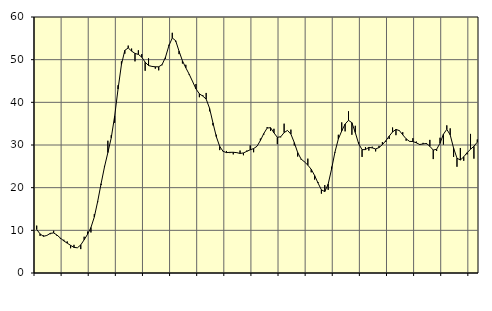
| Category | Piggar | Series 1 |
|---|---|---|
| nan | 11.1 | 10.21 |
| 87.0 | 8.7 | 9.15 |
| 87.0 | 8.8 | 8.6 |
| 87.0 | 8.8 | 8.8 |
| nan | 9.1 | 9.29 |
| 88.0 | 9.9 | 9.39 |
| 88.0 | 8.7 | 8.89 |
| 88.0 | 8 | 8.18 |
| nan | 7.8 | 7.52 |
| 89.0 | 7.4 | 7 |
| 89.0 | 5.8 | 6.48 |
| 89.0 | 6.6 | 6 |
| nan | 5.9 | 5.91 |
| 90.0 | 5.6 | 6.58 |
| 90.0 | 8.5 | 7.78 |
| 90.0 | 9.7 | 9.07 |
| nan | 9.5 | 10.66 |
| 91.0 | 13.8 | 13.12 |
| 91.0 | 16.6 | 16.79 |
| 91.0 | 20.6 | 20.93 |
| nan | 25.1 | 24.85 |
| 92.0 | 31 | 28.22 |
| 92.0 | 32.3 | 31.69 |
| 92.0 | 35.2 | 36.75 |
| nan | 44 | 43.11 |
| 93.0 | 49.6 | 48.84 |
| 93.0 | 51.4 | 52.18 |
| 93.0 | 53.3 | 52.75 |
| nan | 52.6 | 52.01 |
| 94.0 | 49.6 | 51.46 |
| 94.0 | 52.2 | 51.23 |
| 94.0 | 51.3 | 50.59 |
| nan | 47.4 | 49.42 |
| 95.0 | 50.3 | 48.62 |
| 95.0 | 48.4 | 48.42 |
| 95.0 | 47.9 | 48.33 |
| nan | 47.5 | 48.33 |
| 96.0 | 48.7 | 48.84 |
| 96.0 | 50.2 | 50.58 |
| 96.0 | 53.5 | 53.26 |
| nan | 56.3 | 55.09 |
| 97.0 | 54.2 | 54.45 |
| 97.0 | 51.3 | 52 |
| 97.0 | 49.1 | 49.74 |
| nan | 48.8 | 48.09 |
| 98.0 | 46.4 | 46.58 |
| 98.0 | 44.8 | 44.87 |
| 98.0 | 44.3 | 43.14 |
| nan | 41.2 | 41.99 |
| 99.0 | 41.7 | 41.47 |
| 99.0 | 42.2 | 40.76 |
| 99.0 | 37.9 | 38.61 |
| nan | 34.6 | 35.19 |
| 0.0 | 32.4 | 31.94 |
| 0.0 | 28.8 | 29.66 |
| 0.0 | 28.6 | 28.51 |
| nan | 28.6 | 28.22 |
| 1.0 | 28.1 | 28.28 |
| 1.0 | 27.8 | 28.29 |
| 1.0 | 28.3 | 28.21 |
| nan | 28.7 | 28.02 |
| 2.0 | 27.6 | 28.14 |
| 2.0 | 28.7 | 28.51 |
| 2.0 | 29.9 | 28.88 |
| nan | 28.3 | 29.16 |
| 3.0 | 29.7 | 29.7 |
| 3.0 | 31.5 | 31.05 |
| 3.0 | 32.4 | 32.68 |
| nan | 34.2 | 33.97 |
| 4.0 | 33.3 | 34.06 |
| 4.0 | 33.8 | 32.85 |
| 4.0 | 30.2 | 31.8 |
| nan | 31.8 | 31.93 |
| 5.0 | 35 | 32.91 |
| 5.0 | 33.4 | 33.41 |
| 5.0 | 33.6 | 32.55 |
| nan | 29.9 | 30.57 |
| 6.0 | 27.3 | 28.24 |
| 6.0 | 26.6 | 26.72 |
| 6.0 | 26.1 | 26.05 |
| nan | 26.8 | 25.29 |
| 7.0 | 23.6 | 24.3 |
| 7.0 | 21.9 | 22.85 |
| 7.0 | 21.3 | 21.09 |
| nan | 18.6 | 19.49 |
| 8.0 | 20.6 | 19.08 |
| 8.0 | 19.5 | 20.84 |
| 8.0 | 24.9 | 24.37 |
| nan | 28.2 | 28.34 |
| 9.0 | 32.4 | 31.41 |
| 9.0 | 35.3 | 33.29 |
| 9.0 | 33.2 | 34.91 |
| nan | 37.9 | 35.78 |
| 10.0 | 32.4 | 35.23 |
| 10.0 | 34.5 | 32.92 |
| 10.0 | 30.7 | 30.28 |
| nan | 27.2 | 28.91 |
| 11.0 | 29.5 | 28.92 |
| 11.0 | 28.7 | 29.45 |
| 11.0 | 29.6 | 29.32 |
| nan | 28.5 | 29.07 |
| 12.0 | 29.8 | 29.4 |
| 12.0 | 30.7 | 30.09 |
| 12.0 | 30.7 | 30.98 |
| nan | 31.4 | 32.08 |
| 13.0 | 34.1 | 33.06 |
| 13.0 | 32.3 | 33.65 |
| 13.0 | 33.3 | 33.38 |
| nan | 33 | 32.39 |
| 14.0 | 31 | 31.45 |
| 14.0 | 30.9 | 30.85 |
| 14.0 | 31.6 | 30.81 |
| nan | 30.8 | 30.51 |
| 15.0 | 30 | 30.12 |
| 15.0 | 30.5 | 30.24 |
| 15.0 | 30.2 | 30.36 |
| nan | 31.2 | 29.69 |
| 16.0 | 26.7 | 28.82 |
| 16.0 | 28.6 | 28.99 |
| 16.0 | 31.7 | 30.42 |
| nan | 30.1 | 32.52 |
| 17.0 | 34.6 | 33.67 |
| 17.0 | 33.9 | 32.37 |
| 17.0 | 27.2 | 29.27 |
| nan | 24.9 | 26.91 |
| 18.0 | 29.3 | 26.48 |
| 18.0 | 26.3 | 27.23 |
| 18.0 | 27.8 | 28.21 |
| nan | 32.6 | 29 |
| 19.0 | 26.8 | 29.7 |
| 19.0 | 31.3 | 30.68 |